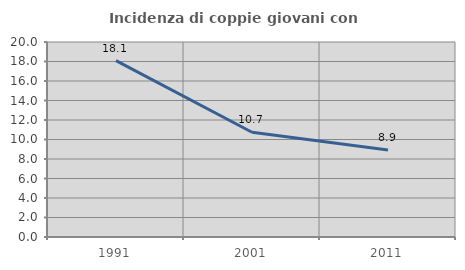
| Category | Incidenza di coppie giovani con figli |
|---|---|
| 1991.0 | 18.088 |
| 2001.0 | 10.747 |
| 2011.0 | 8.924 |